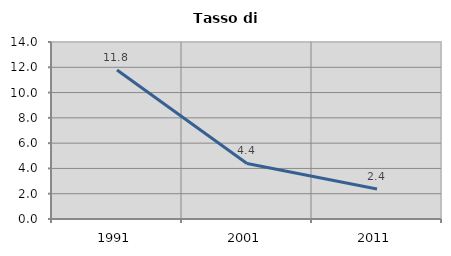
| Category | Tasso di disoccupazione   |
|---|---|
| 1991.0 | 11.79 |
| 2001.0 | 4.396 |
| 2011.0 | 2.367 |